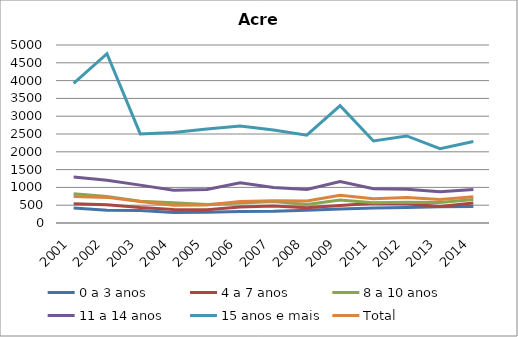
| Category | 0 a 3 anos | 4 a 7 anos | 8 a 10 anos | 11 a 14 anos | 15 anos e mais | Total |
|---|---|---|---|---|---|---|
| 2001.0 | 422.5 | 539.5 | 823.1 | 1291.5 | 3920.1 | 741.4 |
| 2002.0 | 358.7 | 512.6 | 745.3 | 1198.2 | 4756.2 | 719.5 |
| 2003.0 | 352.5 | 433.2 | 613 | 1063.7 | 2501.8 | 601.5 |
| 2004.0 | 297.3 | 381.4 | 567.3 | 919.8 | 2543.1 | 496.3 |
| 2005.0 | 301.3 | 370.4 | 518.3 | 939.6 | 2640.1 | 506 |
| 2006.0 | 323.7 | 447.4 | 561.5 | 1132.3 | 2725.2 | 606.1 |
| 2007.0 | 326.6 | 476.2 | 600.9 | 995.6 | 2612.1 | 626.7 |
| 2008.0 | 361.1 | 431.7 | 519.8 | 944.1 | 2466.3 | 618 |
| 2009.0 | 393.9 | 490.5 | 644.7 | 1162.4 | 3295.8 | 781.5 |
| 2011.0 | 421.7 | 558.1 | 567.1 | 964.6 | 2305.9 | 682.6 |
| 2012.0 | 432.7 | 541 | 581.5 | 947.1 | 2445 | 715.3 |
| 2013.0 | 458 | 464.5 | 573.4 | 876.7 | 2090 | 659.5 |
| 2014.0 | 464.9 | 559.1 | 659.4 | 942.4 | 2290.9 | 739.3 |